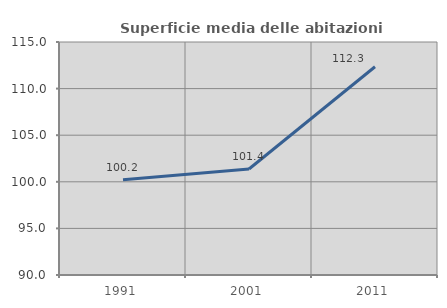
| Category | Superficie media delle abitazioni occupate |
|---|---|
| 1991.0 | 100.208 |
| 2001.0 | 101.371 |
| 2011.0 | 112.344 |